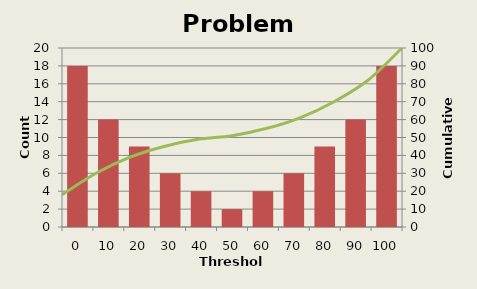
| Category | Count |
|---|---|
| 0.0 | 18 |
| 10.0 | 12 |
| 20.0 | 9 |
| 30.0 | 6 |
| 40.0 | 4 |
| 50.0 | 2 |
| 60.0 | 4 |
| 70.0 | 6 |
| 80.0 | 9 |
| 90.0 | 12 |
| 100.0 | 18 |